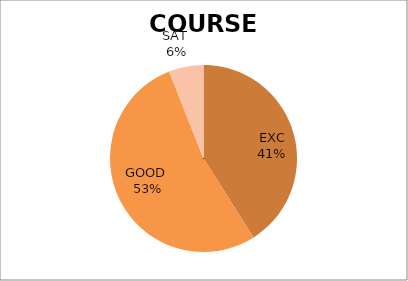
| Category | Series 0 |
|---|---|
| EXC | 41 |
| GOOD  | 53 |
| SAT  | 6 |